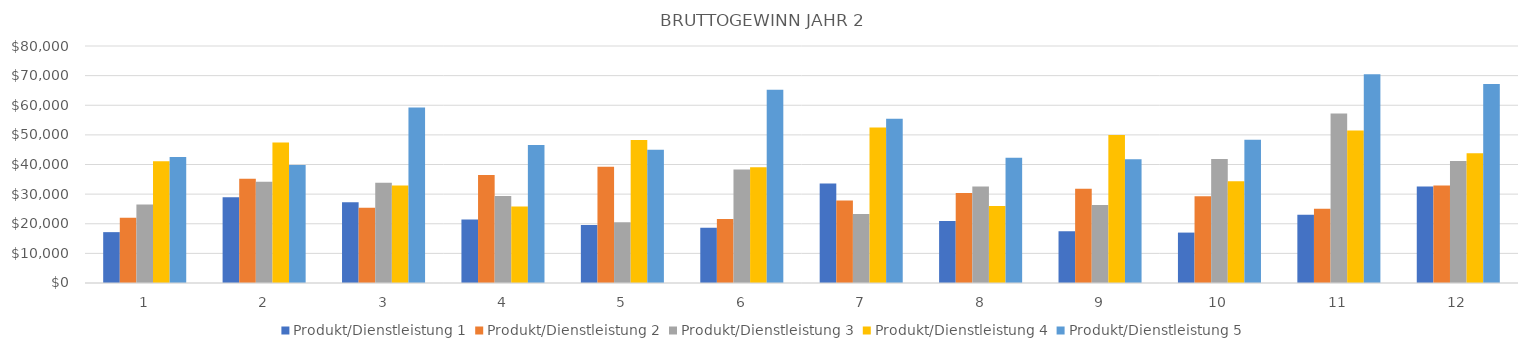
| Category | Produkt/Dienstleistung 1 | Produkt/Dienstleistung 2 | Produkt/Dienstleistung 3 | Produkt/Dienstleistung 4 | Produkt/Dienstleistung 5 |
|---|---|---|---|---|---|
| 0 | 17167.8 | 21992.6 | 26467 | 41126.4 | 42546 |
| 1 | 28975.1 | 35202.65 | 34178.4 | 47385.9 | 39830 |
| 2 | 27264 | 25397.75 | 33852 | 32945 | 59276 |
| 3 | 21413.6 | 36433.8 | 29356.6 | 25861.5 | 46578 |
| 4 | 19574.7 | 39261.6 | 20536 | 48289.5 | 45010 |
| 5 | 18637.5 | 21563.4 | 38322 | 39049.5 | 65212 |
| 6 | 33575.9 | 27828.85 | 23328 | 52448 | 55468 |
| 7 | 20959.2 | 30360 | 32580 | 26026 | 42238 |
| 8 | 17437.6 | 31848 | 26289 | 49962 | 41748 |
| 9 | 17017 | 29310.05 | 41841 | 34386 | 48356 |
| 10 | 23032.1 | 25074.75 | 57220.9 | 51454 | 70490 |
| 11 | 32578 | 32910 | 41140 | 43836 | 67192 |